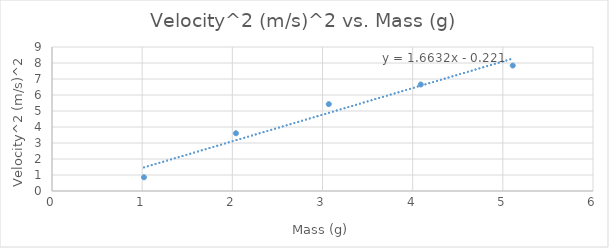
| Category | Velocity^2 (m/s)^2 |
|---|---|
| 1.02 | 0.857 |
| 2.04 | 3.61 |
| 3.07 | 5.429 |
| 4.09 | 6.656 |
| 5.11 | 7.84 |